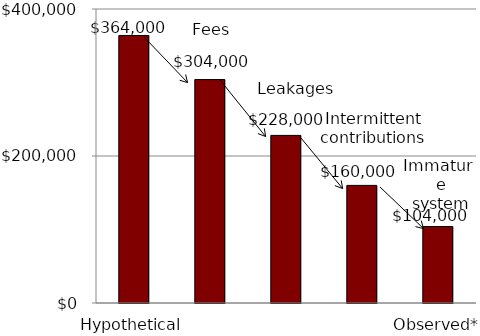
| Category | Series 0 |
|---|---|
| Hypothetical | 364000 |
|  | 304000 |
|  | 228000 |
|  | 160000 |
| Observed* | 104000 |